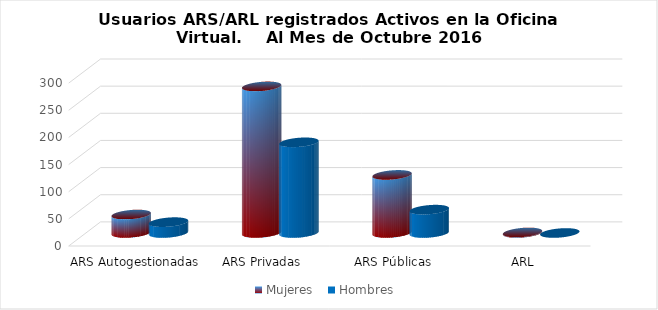
| Category | Mujeres | Hombres |
|---|---|---|
| ARS Autogestionadas | 34 | 20 |
| ARS Privadas | 270 | 167 |
| ARS Públicas | 107 | 43 |
| ARL | 1 | 0 |